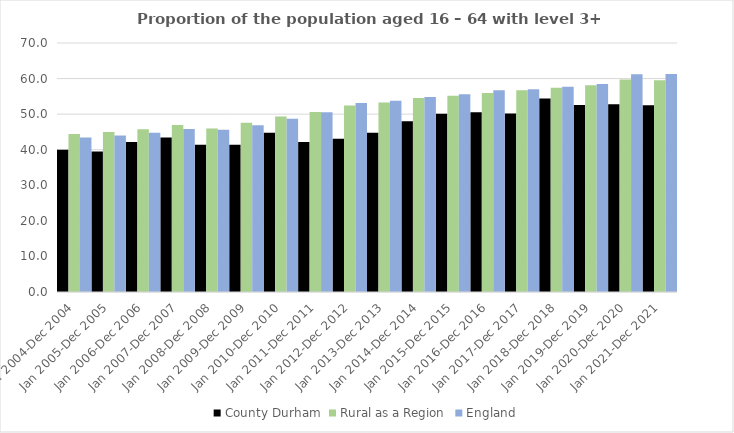
| Category | County Durham | Rural as a Region | England |
|---|---|---|---|
| Jan 2004-Dec 2004 | 40 | 44.405 | 43.4 |
| Jan 2005-Dec 2005 | 39.5 | 44.973 | 44 |
| Jan 2006-Dec 2006 | 42.2 | 45.774 | 44.8 |
| Jan 2007-Dec 2007 | 43.4 | 46.968 | 45.8 |
| Jan 2008-Dec 2008 | 41.4 | 45.964 | 45.6 |
| Jan 2009-Dec 2009 | 41.4 | 47.59 | 46.9 |
| Jan 2010-Dec 2010 | 44.8 | 49.362 | 48.7 |
| Jan 2011-Dec 2011 | 42.2 | 50.602 | 50.5 |
| Jan 2012-Dec 2012 | 43.1 | 52.439 | 53.1 |
| Jan 2013-Dec 2013 | 44.8 | 53.276 | 53.8 |
| Jan 2014-Dec 2014 | 48 | 54.57 | 54.8 |
| Jan 2015-Dec 2015 | 50.1 | 55.16 | 55.6 |
| Jan 2016-Dec 2016 | 50.5 | 55.941 | 56.7 |
| Jan 2017-Dec 2017 | 50.2 | 56.689 | 57 |
| Jan 2018-Dec 2018 | 54.4 | 57.389 | 57.7 |
| Jan 2019-Dec 2019 | 52.6 | 58.147 | 58.5 |
| Jan 2020-Dec 2020 | 52.8 | 59.771 | 61.2 |
| Jan 2021-Dec 2021 | 52.5 | 59.54 | 61.3 |